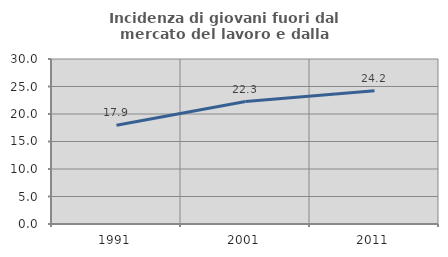
| Category | Incidenza di giovani fuori dal mercato del lavoro e dalla formazione  |
|---|---|
| 1991.0 | 17.949 |
| 2001.0 | 22.266 |
| 2011.0 | 24.224 |